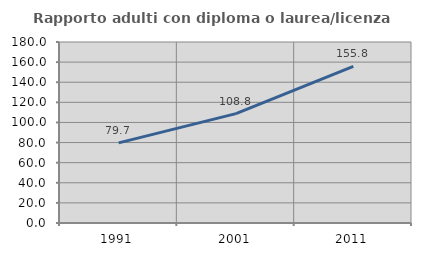
| Category | Rapporto adulti con diploma o laurea/licenza media  |
|---|---|
| 1991.0 | 79.661 |
| 2001.0 | 108.75 |
| 2011.0 | 155.762 |